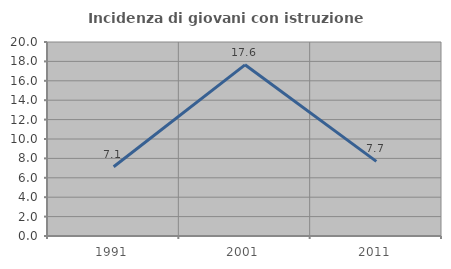
| Category | Incidenza di giovani con istruzione universitaria |
|---|---|
| 1991.0 | 7.143 |
| 2001.0 | 17.647 |
| 2011.0 | 7.692 |